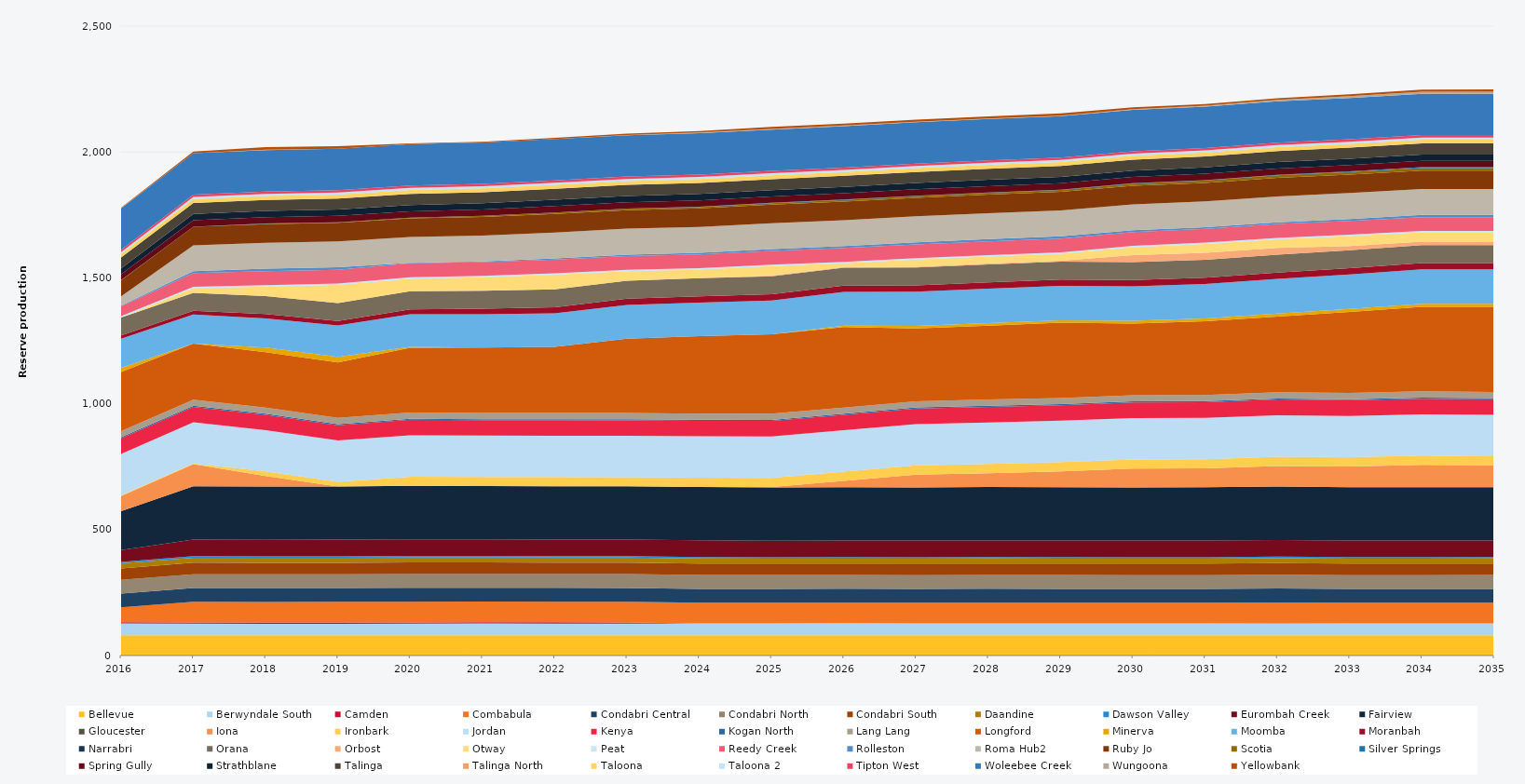
| Category | Bellevue | Berwyndale South | Camden | Combabula | Condabri Central | Condabri North | Condabri South | Daandine | Dawson Valley | Eurombah Creek | Fairview | Gloucester | Iona | Ironbark | Jordan | Kenya | Kogan North | Lang Lang | Longford | Minerva | Moomba | Moranbah | Narrabri | Orana | Orbost | Otway | Peat | Reedy Creek | Rolleston | Roma Hub2 | Ruby Jo | Scotia | Silver Springs | Spring Gully | Strathblane | Talinga | Talinga North | Taloona | Taloona 2 | Tipton West | Woleebee Creek | Wungoona | Yellowbank |
|---|---|---|---|---|---|---|---|---|---|---|---|---|---|---|---|---|---|---|---|---|---|---|---|---|---|---|---|---|---|---|---|---|---|---|---|---|---|---|---|---|---|---|---|
| 2016 | 80.52 | 46.858 | 5 | 59.321 | 54.403 | 54.604 | 44.974 | 20.13 | 5.856 | 47.032 | 154.109 | 0 | 60.472 | 2.597 | 164.7 | 61.862 | 4.392 | 24.522 | 235.041 | 16 | 115.657 | 13.152 | 0 | 71.044 | 0 | 0 | 5.49 | 39.223 | 2.473 | 37.005 | 64.014 | 0.986 | 0.204 | 23.055 | 22.903 | 43.421 | 0 | 13.515 | 7.501 | 9.516 | 164.7 | 0.512 | 2.429 |
| 2017 | 80.3 | 46.126 | 5 | 82.125 | 54.75 | 54.75 | 45.625 | 20.075 | 5.84 | 65.7 | 211.671 | 0 | 88.438 | 2.005 | 164.25 | 60.958 | 4.38 | 24.455 | 222.562 | 0 | 115.039 | 14.795 | 0 | 71.175 | 0 | 19.039 | 5.475 | 54.75 | 6.728 | 102.889 | 73.702 | 0.661 | 0.041 | 25.185 | 25.185 | 43.8 | 0 | 15.33 | 8.395 | 9.49 | 164.25 | 0.092 | 6.731 |
| 2018 | 80.3 | 45.597 | 5 | 82.125 | 54.75 | 54.75 | 45.625 | 20.075 | 5.84 | 65.7 | 211.7 | 0 | 41.35 | 18.088 | 164.25 | 60.63 | 4.38 | 24.455 | 220 | 18.735 | 115.271 | 17.982 | 0 | 71.175 | 0 | 38 | 5.475 | 54.75 | 10.524 | 102.93 | 73.702 | 1.696 | 0.688 | 25.185 | 25.185 | 43.8 | 0 | 15.33 | 8.395 | 9.49 | 164.25 | 1.594 | 10.341 |
| 2019 | 80.3 | 45.824 | 5 | 82.125 | 54.75 | 54.75 | 45.625 | 20.075 | 5.84 | 65.7 | 211.7 | 0 | 0 | 18.25 | 164.25 | 60.599 | 4.38 | 24.455 | 220 | 22.558 | 124.598 | 18.049 | 0 | 71.175 | 0 | 71.919 | 5.475 | 54.75 | 10.102 | 102.93 | 73.702 | 1.957 | 0.035 | 25.185 | 25.185 | 43.8 | 0 | 15.33 | 8.395 | 9.49 | 164.25 | 0.028 | 10.069 |
| 2020 | 80.52 | 46.04 | 5 | 82.35 | 54.9 | 54.9 | 45.75 | 20.13 | 5.856 | 65.88 | 212.28 | 0 | 0 | 36.6 | 164.7 | 61.216 | 4.392 | 24.522 | 257.268 | 3.457 | 129.894 | 19.619 | 0 | 71.37 | 0 | 50.525 | 5.49 | 54.9 | 2.015 | 103.212 | 73.873 | 2.284 | 0 | 25.254 | 25.254 | 43.92 | 0 | 15.372 | 8.418 | 9.516 | 164.7 | 0.009 | 2.202 |
| 2021 | 80.3 | 46.865 | 5 | 82.125 | 54.75 | 54.75 | 45.625 | 20.075 | 5.84 | 65.7 | 211.7 | 0 | 0 | 36.5 | 164.25 | 60.893 | 4.38 | 24.455 | 260.193 | 0 | 132.006 | 22.179 | 0 | 71.175 | 0 | 53.563 | 5.475 | 54.75 | 2.795 | 102.93 | 73.674 | 4.125 | 0.012 | 25.185 | 25.185 | 43.8 | 0 | 15.33 | 8.395 | 9.49 | 164.25 | 0.004 | 2.987 |
| 2022 | 80.3 | 46.508 | 5 | 82.125 | 54.75 | 54.75 | 45.625 | 20.075 | 5.84 | 65.7 | 211.7 | 0 | 0 | 36.5 | 164.25 | 61.31 | 4.38 | 24.455 | 262.597 | 0 | 133.177 | 24.141 | 0 | 71.175 | 0 | 57.992 | 5.475 | 54.75 | 4.844 | 102.93 | 73.63 | 5.719 | 0.002 | 25.185 | 25.185 | 43.8 | 0 | 15.33 | 8.395 | 9.49 | 164.25 | 0.026 | 4.872 |
| 2023 | 80.3 | 46.253 | 5 | 82.125 | 54.75 | 54.75 | 45.625 | 20.075 | 5.84 | 65.7 | 211.7 | 0 | 0 | 36.5 | 164.25 | 61.266 | 4.38 | 24.455 | 295.789 | 0 | 133.46 | 24.787 | 0 | 71.175 | 0 | 38 | 5.475 | 54.75 | 6.01 | 102.93 | 73.586 | 6.125 | 0.032 | 25.185 | 25.185 | 43.8 | 0 | 15.33 | 8.395 | 9.49 | 164.25 | 0.132 | 5.862 |
| 2024 | 80.52 | 47.021 | 0 | 82.35 | 54.9 | 54.9 | 45.75 | 20.13 | 5.856 | 65.88 | 212.28 | 0 | 0 | 36.6 | 164.7 | 60.894 | 4.392 | 24.522 | 307.965 | 0 | 133.338 | 24.888 | 0 | 71.37 | 0 | 34.567 | 5.49 | 54.9 | 5.851 | 103.212 | 73.713 | 5.756 | 0.954 | 25.254 | 25.254 | 43.92 | 0 | 15.372 | 8.418 | 9.516 | 164.7 | 2.407 | 5.787 |
| 2025 | 80.3 | 47.64 | 0 | 82.125 | 54.75 | 54.75 | 45.625 | 19.336 | 5.84 | 65.7 | 211.7 | 0 | 1.553 | 36.5 | 164.25 | 61.86 | 4.045 | 24.455 | 315.053 | 0.523 | 134.094 | 24.82 | 0 | 71.175 | 2.367 | 38 | 5.475 | 54.75 | 7.48 | 102.93 | 73.498 | 6.244 | 1.067 | 25.185 | 25.185 | 43.8 | 0 | 15.33 | 8.395 | 8.962 | 164.25 | 2.754 | 7.499 |
| 2026 | 80.3 | 47.86 | 0 | 82.125 | 54.75 | 54.75 | 45.625 | 19.529 | 5.84 | 65.7 | 211.7 | 0 | 25.685 | 36.5 | 164.25 | 61.64 | 4.146 | 24.455 | 320.115 | 5.083 | 134.465 | 24.82 | 0 | 71.175 | 2.723 | 14.989 | 5.475 | 54.75 | 7.721 | 102.93 | 73.455 | 7.122 | 1.307 | 25.185 | 25.185 | 43.8 | 0 | 15.33 | 8.395 | 9.089 | 164.25 | 3.118 | 7.69 |
| 2027 | 80.3 | 47.5 | 0 | 82.125 | 54.75 | 54.75 | 45.625 | 19.698 | 5.84 | 65.7 | 211.7 | 0 | 50.657 | 36.5 | 164.25 | 62 | 4.203 | 24.455 | 289.153 | 9.876 | 135.856 | 24.82 | 0 | 71.175 | 3.032 | 28.871 | 5.475 | 54.75 | 8.204 | 102.93 | 73.411 | 7.757 | 1.044 | 25.185 | 25.185 | 43.8 | 0 | 15.33 | 8.395 | 9.162 | 164.25 | 2.517 | 8.125 |
| 2028 | 80.52 | 47.16 | 0 | 82.35 | 54.9 | 54.9 | 45.75 | 19.748 | 5.856 | 65.88 | 212.28 | 0 | 54.547 | 36.6 | 164.7 | 62.64 | 4.206 | 24.522 | 293.862 | 10.153 | 136.649 | 24.888 | 0 | 71.37 | 3.398 | 27.894 | 5.49 | 54.9 | 8.465 | 103.212 | 73.537 | 7.835 | 0.729 | 25.254 | 25.254 | 43.92 | 0 | 15.372 | 8.418 | 9.257 | 164.7 | 1.851 | 8.457 |
| 2029 | 80.3 | 47.66 | 0 | 82.125 | 54.75 | 54.75 | 45.625 | 19.778 | 5.84 | 65.7 | 211.7 | 0 | 63.489 | 36.5 | 164.25 | 61.84 | 4.25 | 24.455 | 298.821 | 9.708 | 136.729 | 24.82 | 0 | 71.175 | 3.565 | 28.126 | 5.475 | 54.75 | 8.992 | 102.93 | 73.323 | 7.993 | 0.874 | 25.185 | 25.185 | 43.8 | 0 | 15.33 | 8.395 | 9.313 | 164.25 | 2.225 | 8.922 |
| 2030 | 80.3 | 47.3 | 0 | 82.125 | 54.75 | 54.75 | 45.625 | 19.901 | 5.84 | 65.7 | 211.7 | 0 | 73.991 | 36.5 | 164.25 | 62.2 | 4.28 | 24.455 | 285.075 | 11.147 | 136.875 | 24.82 | 0 | 71.175 | 27.375 | 31.796 | 5.475 | 54.75 | 7.048 | 102.93 | 73.279 | 8.858 | 1.22 | 25.185 | 25.185 | 43.8 | 0 | 15.33 | 8.395 | 9.366 | 164.25 | 2.97 | 7.188 |
| 2031 | 80.3 | 47.3 | 0 | 82.125 | 54.75 | 54.75 | 45.625 | 19.908 | 5.84 | 65.7 | 211.7 | 0 | 75.241 | 36.5 | 164.25 | 62.2 | 4.371 | 24.455 | 292.883 | 11.178 | 136.875 | 24.82 | 0 | 71.175 | 27.375 | 35.261 | 5.475 | 54.75 | 6.262 | 102.93 | 73.235 | 9.418 | 1.645 | 25.185 | 25.185 | 43.8 | 0 | 15.33 | 8.395 | 9.42 | 164.25 | 4.099 | 6.297 |
| 2032 | 80.52 | 47.4 | 0.913 | 82.35 | 54.9 | 54.9 | 45.75 | 20.093 | 5.856 | 65.88 | 212.28 | 0 | 82.095 | 36.6 | 164.7 | 62.4 | 4.358 | 24.522 | 300.923 | 11.902 | 137.25 | 24.888 | 0 | 71.37 | 27.45 | 34.163 | 5.49 | 54.9 | 6.588 | 103.212 | 73.361 | 9.909 | 2.221 | 25.254 | 25.254 | 43.92 | 0 | 15.372 | 8.418 | 9.478 | 164.7 | 5.58 | 6.715 |
| 2033 | 80.3 | 47.34 | 0.087 | 82.125 | 54.75 | 54.75 | 45.625 | 20.058 | 5.84 | 65.7 | 211.7 | 0 | 82.671 | 36.5 | 164.25 | 62.16 | 4.352 | 24.455 | 322.3 | 11.725 | 136.875 | 24.82 | 0 | 71.175 | 16.388 | 40.007 | 5.475 | 54.75 | 7.632 | 102.93 | 73.147 | 10.316 | 2.8 | 25.185 | 25.185 | 43.8 | 0 | 15.33 | 8.395 | 9.477 | 164.25 | 7.054 | 7.705 |
| 2034 | 80.3 | 47.38 | 0 | 82.125 | 54.75 | 54.75 | 45.625 | 20.052 | 5.84 | 65.7 | 211.7 | 0 | 89.055 | 36.5 | 164.25 | 62.12 | 4.377 | 24.455 | 336.242 | 11.817 | 136.875 | 24.82 | 0 | 71.175 | 13.79 | 37.251 | 5.475 | 54.75 | 8.642 | 102.93 | 73.103 | 10.619 | 3.107 | 25.185 | 25.185 | 43.8 | 0 | 15.33 | 8.395 | 9.477 | 164.25 | 7.661 | 8.602 |
| 2035 | 80.3 | 47.66 | 0 | 82.125 | 54.75 | 54.75 | 45.625 | 20.053 | 5.84 | 65.7 | 211.7 | 0 | 86.726 | 36.5 | 164.25 | 61.84 | 4.38 | 24.455 | 338.546 | 11.753 | 136.875 | 24.82 | 0 | 71.175 | 12.6 | 38.17 | 5.475 | 54.75 | 9.028 | 102.93 | 72.753 | 10.546 | 3.411 | 25.185 | 25.185 | 43.8 | 0 | 15.33 | 8.395 | 9.49 | 164.25 | 8.481 | 9.126 |